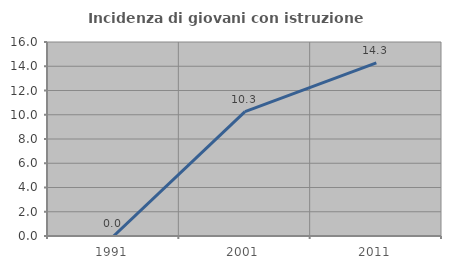
| Category | Incidenza di giovani con istruzione universitaria |
|---|---|
| 1991.0 | 0 |
| 2001.0 | 10.256 |
| 2011.0 | 14.286 |